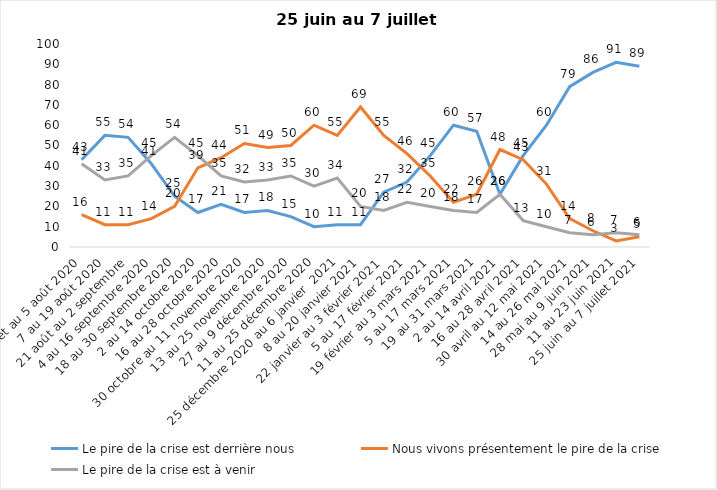
| Category | Le pire de la crise est derrière nous | Nous vivons présentement le pire de la crise | Le pire de la crise est à venir |
|---|---|---|---|
| 24 juillet au 5 août 2020 | 43 | 16 | 41 |
| 7 au 19 août 2020 | 55 | 11 | 33 |
| 21 août au 2 septembre | 54 | 11 | 35 |
| 4 au 16 septembre 2020 | 41 | 14 | 45 |
| 18 au 30 septembre 2020 | 25 | 20 | 54 |
| 2 au 14 octobre 2020 | 17 | 39 | 45 |
| 16 au 28 octobre 2020 | 21 | 44 | 35 |
| 30 octobre au 11 novembre 2020 | 17 | 51 | 32 |
| 13 au 25 novembre 2020 | 18 | 49 | 33 |
| 27 au 9 décembre 2020 | 15 | 50 | 35 |
| 11 au 25 décembre 2020 | 10 | 60 | 30 |
| 25 décembre 2020 au 6 janvier  2021 | 11 | 55 | 34 |
| 8 au 20 janvier 2021 | 11 | 69 | 20 |
| 22 janvier au 3 février 2021 | 27 | 55 | 18 |
| 5 au 17 février 2021 | 32 | 46 | 22 |
| 19 février au 3 mars 2021 | 45 | 35 | 20 |
| 5 au 17 mars 2021 | 60 | 22 | 18 |
| 19 au 31 mars 2021 | 57 | 26 | 17 |
| 2 au 14 avril 2021 | 26 | 48 | 26 |
| 16 au 28 avril 2021 | 45 | 43 | 13 |
| 30 avril au 12 mai 2021 | 60 | 31 | 10 |
| 14 au 26 mai 2021 | 79 | 14 | 7 |
| 28 mai au 9 juin 2021 | 86 | 8 | 6 |
| 11 au 23 juin 2021 | 91 | 3 | 7 |
| 25 juin au 7 juillet 2021 | 89 | 5 | 6 |